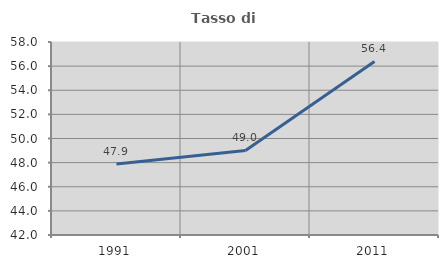
| Category | Tasso di occupazione   |
|---|---|
| 1991.0 | 47.89 |
| 2001.0 | 49.009 |
| 2011.0 | 56.384 |